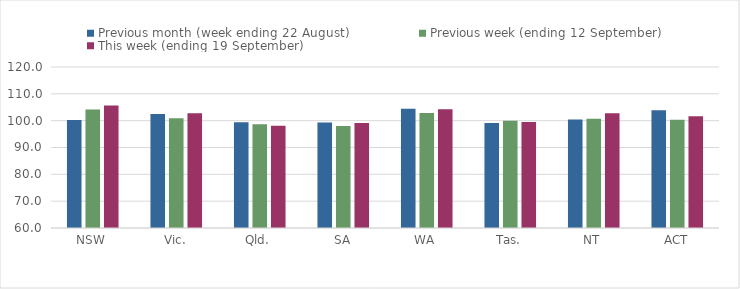
| Category | Previous month (week ending 22 August) | Previous week (ending 12 September) | This week (ending 19 September) |
|---|---|---|---|
| NSW | 100.25 | 104.16 | 105.65 |
| Vic. | 102.47 | 100.93 | 102.78 |
| Qld. | 99.37 | 98.65 | 98.07 |
| SA | 99.28 | 98.04 | 99.11 |
| WA | 104.45 | 102.86 | 104.23 |
| Tas. | 99.09 | 100 | 99.5 |
| NT | 100.48 | 100.72 | 102.74 |
| ACT | 103.87 | 100.35 | 101.64 |